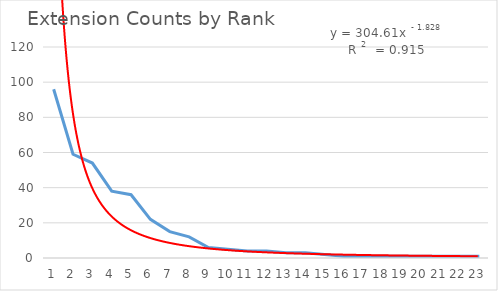
| Category | Series 0 |
|---|---|
| 0 | 96 |
| 1 | 59 |
| 2 | 54 |
| 3 | 38 |
| 4 | 36 |
| 5 | 22 |
| 6 | 15 |
| 7 | 12 |
| 8 | 6 |
| 9 | 5 |
| 10 | 4 |
| 11 | 4 |
| 12 | 3 |
| 13 | 3 |
| 14 | 2 |
| 15 | 1 |
| 16 | 1 |
| 17 | 1 |
| 18 | 1 |
| 19 | 1 |
| 20 | 1 |
| 21 | 1 |
| 22 | 1 |